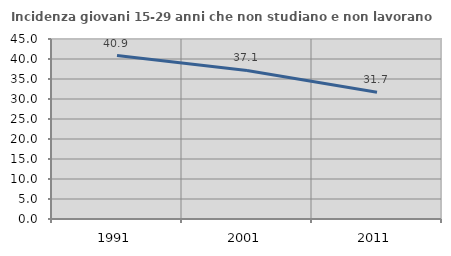
| Category | Incidenza giovani 15-29 anni che non studiano e non lavorano  |
|---|---|
| 1991.0 | 40.86 |
| 2001.0 | 37.136 |
| 2011.0 | 31.671 |